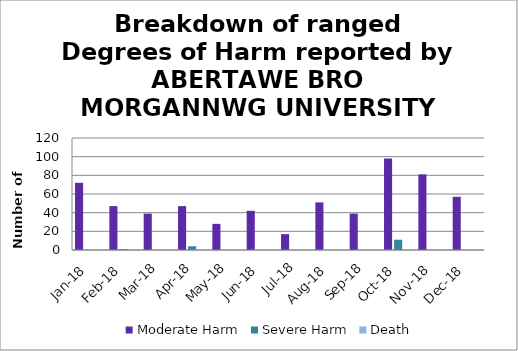
| Category | Moderate Harm | Severe Harm | Death |
|---|---|---|---|
| Jan-18 | 72 | 0 | 0 |
| Feb-18 | 47 | 1 | 0 |
| Mar-18 | 39 | 0 | 0 |
| Apr-18 | 47 | 4 | 0 |
| May-18 | 28 | 0 | 0 |
| Jun-18 | 42 | 0 | 0 |
| Jul-18 | 17 | 0 | 0 |
| Aug-18 | 51 | 0 | 0 |
| Sep-18 | 39 | 0 | 0 |
| Oct-18 | 98 | 11 | 0 |
| Nov-18 | 81 | 0 | 0 |
| Dec-18 | 57 | 0 | 0 |